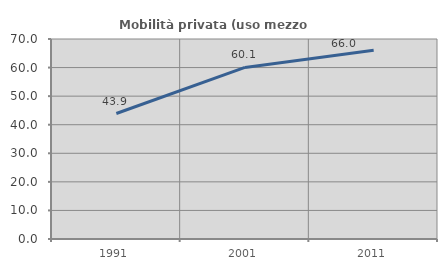
| Category | Mobilità privata (uso mezzo privato) |
|---|---|
| 1991.0 | 43.92 |
| 2001.0 | 60.051 |
| 2011.0 | 66.029 |